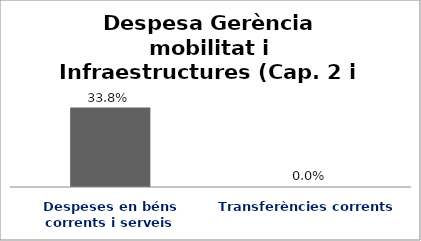
| Category | Series 0 |
|---|---|
| Despeses en béns corrents i serveis | 0.338 |
| Transferències corrents | 0 |